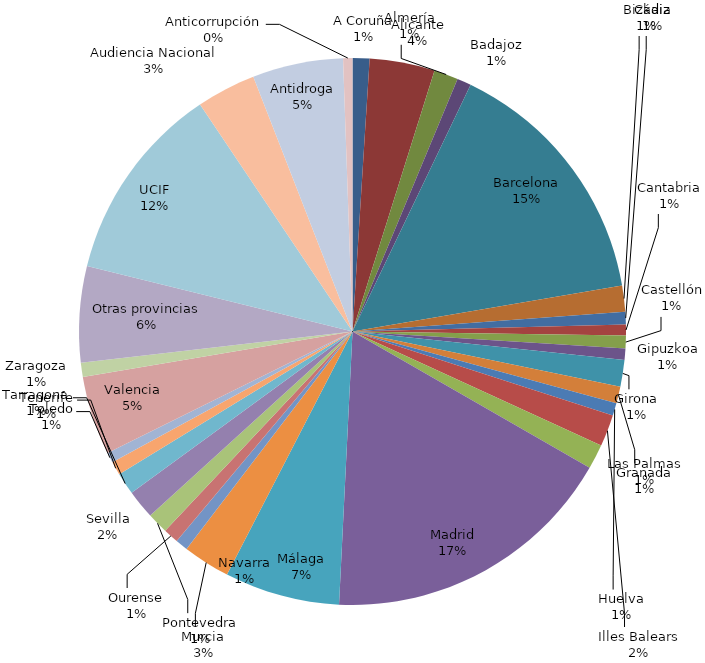
| Category | Comisiones Rogatorias |
|---|---|
| A Coruña | 49 |
| Alicante | 189 |
| Almería | 70 |
| Badajoz | 41 |
| Barcelona | 746 |
| Bizkaia | 76 |
| Cádiz | 36 |
| Cantabria | 32 |
| Castellón | 37 |
| Gipuzkoa | 33 |
| Girona | 77 |
| Granada | 49 |
| Huelva | 36 |
| Illes Balears | 92 |
| Las Palmas | 72 |
| Madrid | 858 |
| Málaga | 334 |
| Murcia | 137 |
| Navarra | 36 |
| Ourense | 44 |
| Pontevedra | 61 |
| Sevilla | 84 |
| Tarragona | 64 |
| Tenerife | 39 |
| Toledo | 30 |
| Valencia | 229 |
| Zaragoza | 41 |
| Otras provincias | 279 |
| UCIF | 576 |
| Audiencia Nacional | 172 |
| Antidroga | 263 |
| Anticorrupción | 27 |